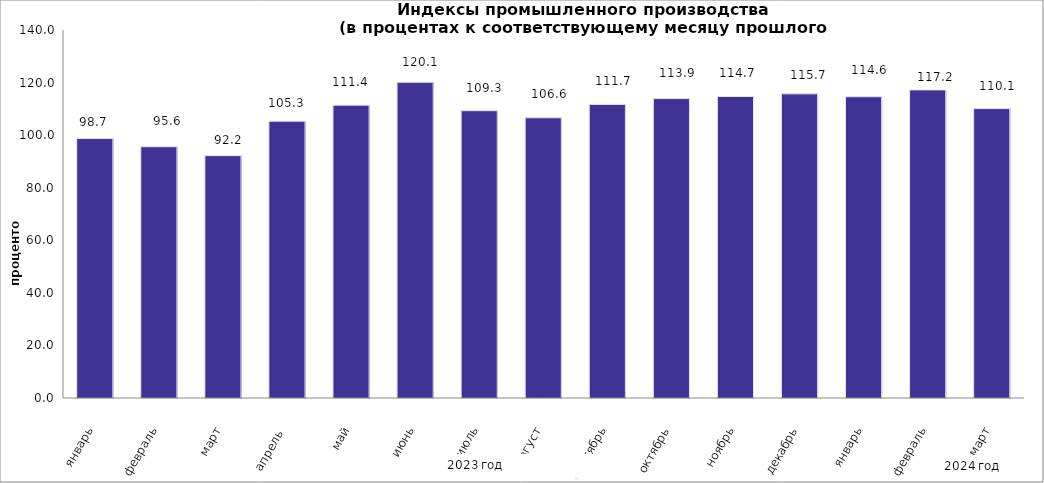
| Category | Series 0 |
|---|---|
| январь | 98.7 |
| февраль | 95.6 |
| март | 92.2 |
| апрель  | 105.3 |
| май | 111.4 |
| июнь | 120.1 |
| июль | 109.3 |
| август | 106.6 |
| сентябрь | 111.7 |
| октябрь | 113.9 |
| ноябрь | 114.7 |
| декабрь | 115.7 |
| январь | 114.6 |
| февраль | 117.2 |
| март | 110.1 |